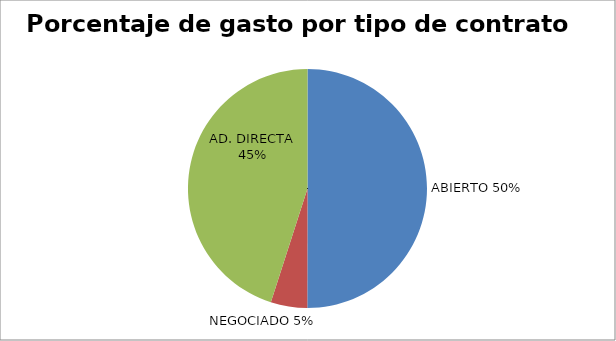
| Category | Series 0 |
|---|---|
| 0 | 8463078.24 |
| 1 | 835307.85 |
| 2 | 7618856.94 |